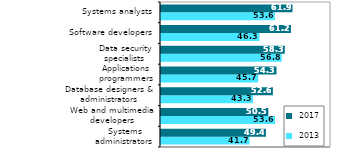
| Category |  2013 |  2017 |
|---|---|---|
| Systems administrators | 41.657 | 49.375 |
| Web and multimedia developers | 53.617 | 50.488 |
| Database designers & administrators | 43.292 | 52.646 |
| Applications programmers | 45.728 | 54.343 |
| Data security specialists  | 56.822 | 58.267 |
| Software developers | 46.341 | 61.157 |
| Systems analysts | 53.586 | 61.883 |